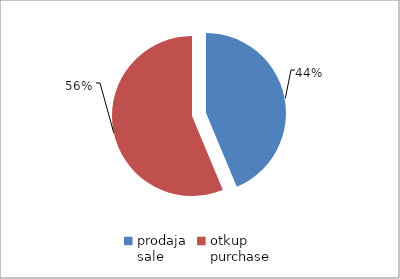
| Category | Series 0 |
|---|---|
| prodaja
sale | 94018383.27 |
| otkup
purchase | 121084047.8 |